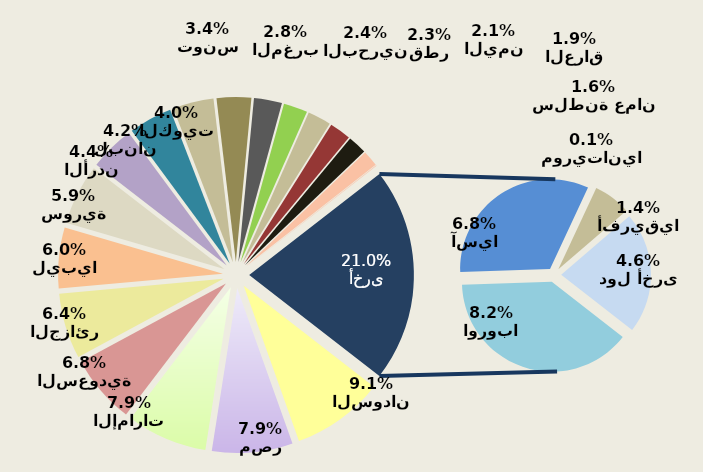
| Category | Series 0 |
|---|---|
| السودان | 887897.407 |
| مصر | 775735.371 |
| الإمارات | 774582.515 |
| السعودية | 662050.711 |
| الجزائر | 631244.047 |
| ليبيا | 585843.851 |
| سورية | 582243.802 |
| الأردن | 431884.028 |
| لبنان | 416314.531 |
| الكويت | 392411.448 |
| تونس | 331952.765 |
| المغرب | 269856.32 |
| البحرين | 230818.779 |
| قطر | 225264.092 |
| اليمن | 205818.468 |
| العراق | 181792.494 |
| سلطنة عمان | 152205.564 |
| موريتانيا | 7674.632 |
| اوروبا | 802753.917 |
| آسيا | 668924.511 |
| أفريقيا | 138796.651 |
| دول أخرى | 449450.596 |